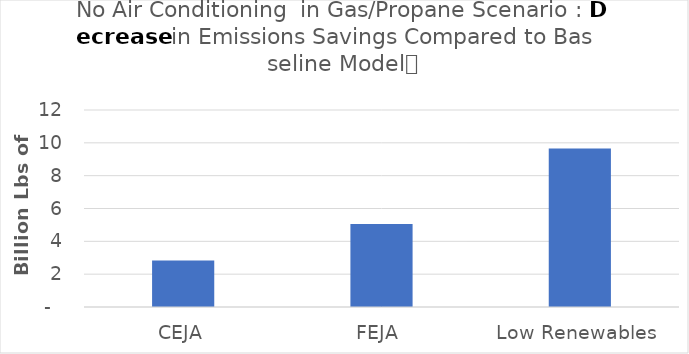
| Category | Heat Pump Scenario Emissions: Increased electricity emissions  due to electrification 
 |
|---|---|
| CEJA | 2834915993.171 |
| FEJA  | 5054798675.093 |
| Low Renewables  | 9648370807.454 |